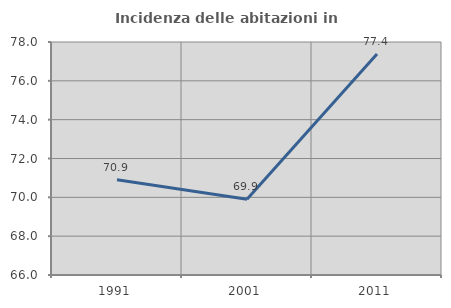
| Category | Incidenza delle abitazioni in proprietà  |
|---|---|
| 1991.0 | 70.909 |
| 2001.0 | 69.903 |
| 2011.0 | 77.381 |